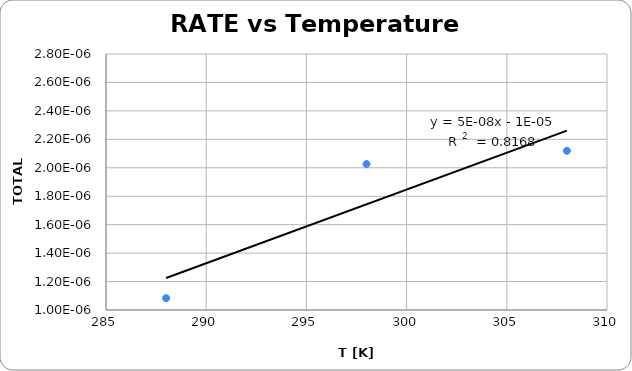
| Category | total rate=[IO3-][HSO3-] |
|---|---|
| 288.0 | 0 |
| 298.0 | 0 |
| 308.0 | 0 |